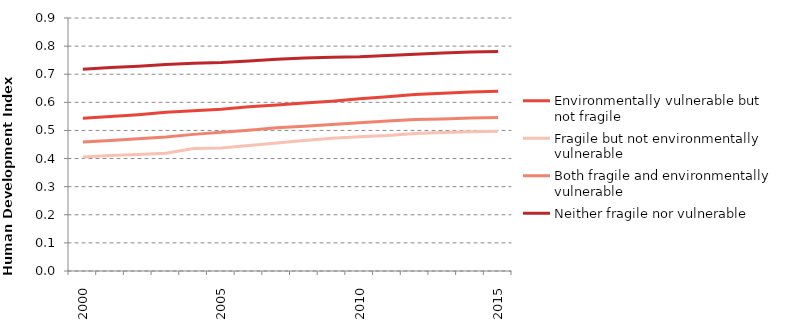
| Category | Environmentally vulnerable but not fragile | Fragile but not environmentally vulnerable | Both fragile and environmentally vulnerable | Neither fragile nor vulnerable |
|---|---|---|---|---|
| 2000.0 | 0.544 | 0.406 | 0.459 | 0.718 |
| 2001.0 | 0.549 | 0.411 | 0.464 | 0.724 |
| 2002.0 | 0.556 | 0.415 | 0.471 | 0.729 |
| 2003.0 | 0.565 | 0.419 | 0.477 | 0.734 |
| 2004.0 | 0.57 | 0.436 | 0.486 | 0.739 |
| 2005.0 | 0.576 | 0.437 | 0.493 | 0.742 |
| 2006.0 | 0.584 | 0.446 | 0.501 | 0.747 |
| 2007.0 | 0.591 | 0.455 | 0.509 | 0.753 |
| 2008.0 | 0.598 | 0.464 | 0.515 | 0.758 |
| 2009.0 | 0.604 | 0.472 | 0.521 | 0.76 |
| 2010.0 | 0.612 | 0.477 | 0.527 | 0.762 |
| 2011.0 | 0.62 | 0.482 | 0.533 | 0.767 |
| 2012.0 | 0.628 | 0.49 | 0.539 | 0.771 |
| 2013.0 | 0.632 | 0.493 | 0.541 | 0.775 |
| 2014.0 | 0.637 | 0.496 | 0.544 | 0.779 |
| 2015.0 | 0.64 | 0.497 | 0.546 | 0.781 |